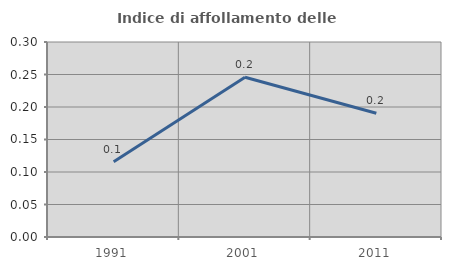
| Category | Indice di affollamento delle abitazioni  |
|---|---|
| 1991.0 | 0.116 |
| 2001.0 | 0.246 |
| 2011.0 | 0.19 |